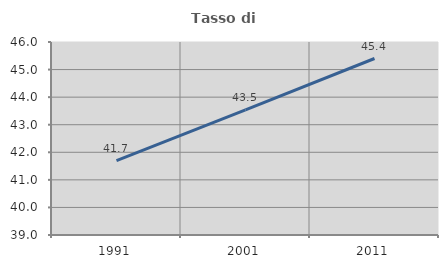
| Category | Tasso di occupazione   |
|---|---|
| 1991.0 | 41.7 |
| 2001.0 | 43.536 |
| 2011.0 | 45.401 |